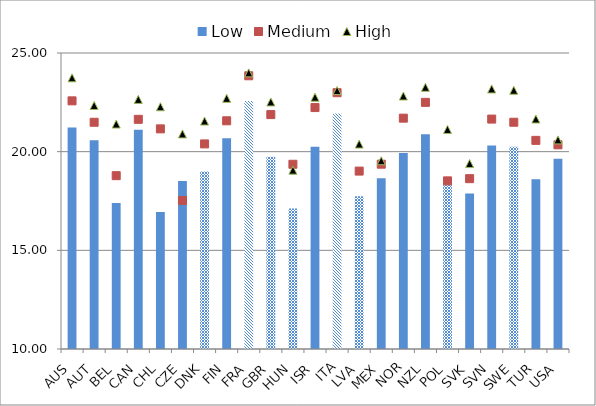
| Category | Low |
|---|---|
| AUS | 21.228 |
| AUT | 20.577 |
| BEL | 17.398 |
| CAN | 21.112 |
| CHL | 16.946 |
| CZE | 18.518 |
| DNK | 18.993 |
| FIN | 20.677 |
| FRA | 22.567 |
| GBR | 19.738 |
| HUN | 17.121 |
| ISR | 20.248 |
| ITA | 21.938 |
| LVA | 17.741 |
| MEX | 18.657 |
| NOR | 19.93 |
| NZL | 20.888 |
| POL | 18.338 |
| SVK | 17.877 |
| SVN | 20.309 |
| SWE | 20.247 |
| TUR | 18.598 |
| USA | 19.641 |